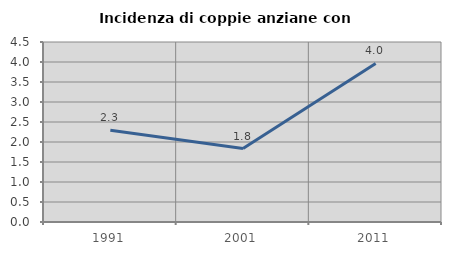
| Category | Incidenza di coppie anziane con figli |
|---|---|
| 1991.0 | 2.292 |
| 2001.0 | 1.837 |
| 2011.0 | 3.964 |